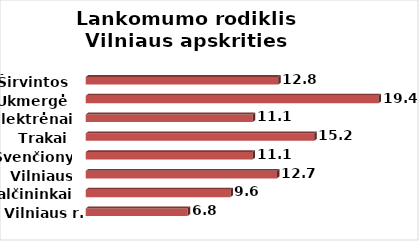
| Category | Series 0 |
|---|---|
| Vilniaus r. | 6.769 |
| Šalčininkai | 9.605 |
| Vilniaus m. | 12.69 |
| Švenčionys | 11.069 |
| Trakai | 15.172 |
| Elektrėnai | 11.086 |
| Ukmergė | 19.438 |
| Širvintos | 12.784 |